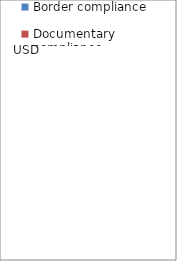
| Category | Border compliance | Documentary compliance |
|---|---|---|
| 0 | 488 | 15 |
| 1 | 477.44 | 147.02 |
| 2 | 579 | 40 |
| 3 | 539.94 | 117.26 |